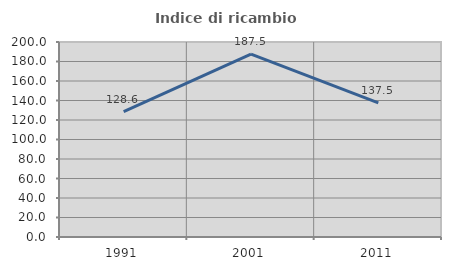
| Category | Indice di ricambio occupazionale  |
|---|---|
| 1991.0 | 128.571 |
| 2001.0 | 187.5 |
| 2011.0 | 137.5 |